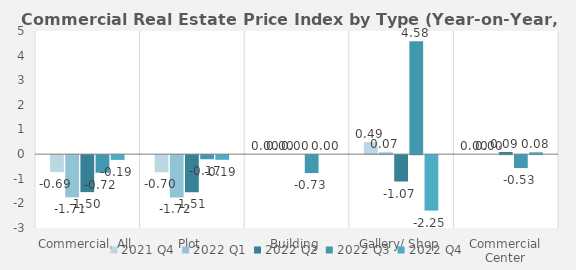
| Category | 2021 | 2022 |
|---|---|---|
| Commercial, All | -0.69 | -0.194 |
| Plot | -0.695 | -0.19 |
| Building | 0 | 0 |
| Gallery/ Shop | 0.486 | -2.252 |
| Commercial Center | 0 | 0.076 |